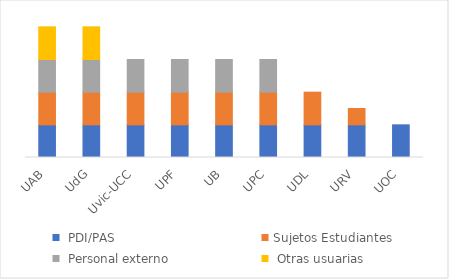
| Category | Series 0 | Sujetos |
|---|---|---|
| UAB | 1 | 1 |
| UdG | 1 | 1 |
| Uvic-UCC | 1 | 0 |
| UPF | 1 | 0 |
| UB | 1 | 0 |
| UPC | 1 | 0 |
| UDL | 1 | 0 |
| URV | 1 | 0 |
| UOC | 1 | 0 |